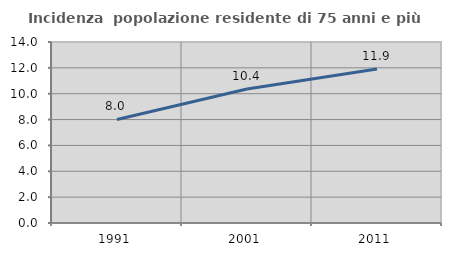
| Category | Incidenza  popolazione residente di 75 anni e più |
|---|---|
| 1991.0 | 8.006 |
| 2001.0 | 10.369 |
| 2011.0 | 11.908 |